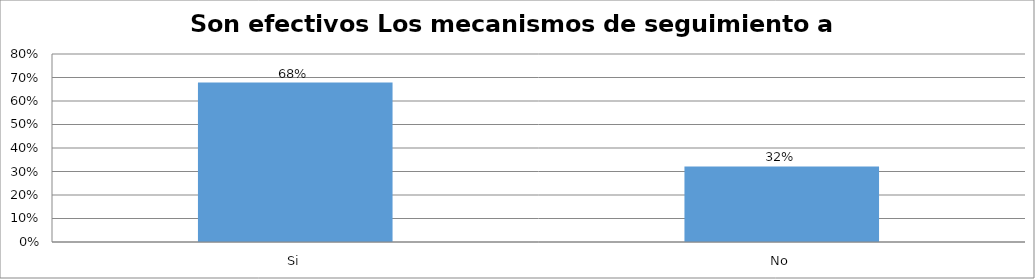
| Category | Series 0 |
|---|---|
| Si | 0.679 |
| No | 0.321 |